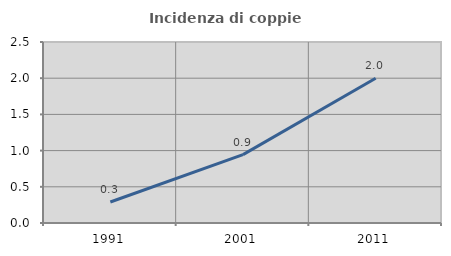
| Category | Incidenza di coppie miste |
|---|---|
| 1991.0 | 0.29 |
| 2001.0 | 0.944 |
| 2011.0 | 2 |